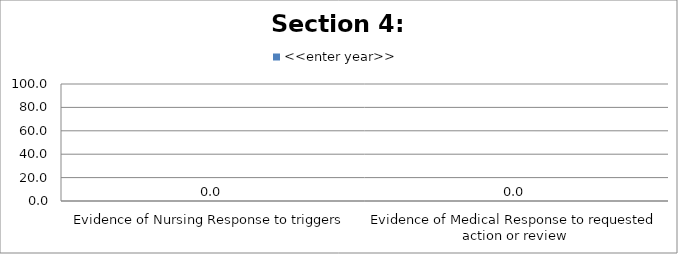
| Category | <<enter year>> |
|---|---|
| Evidence of Nursing Response to triggers | 0 |
| Evidence of Medical Response to requested action or review | 0 |